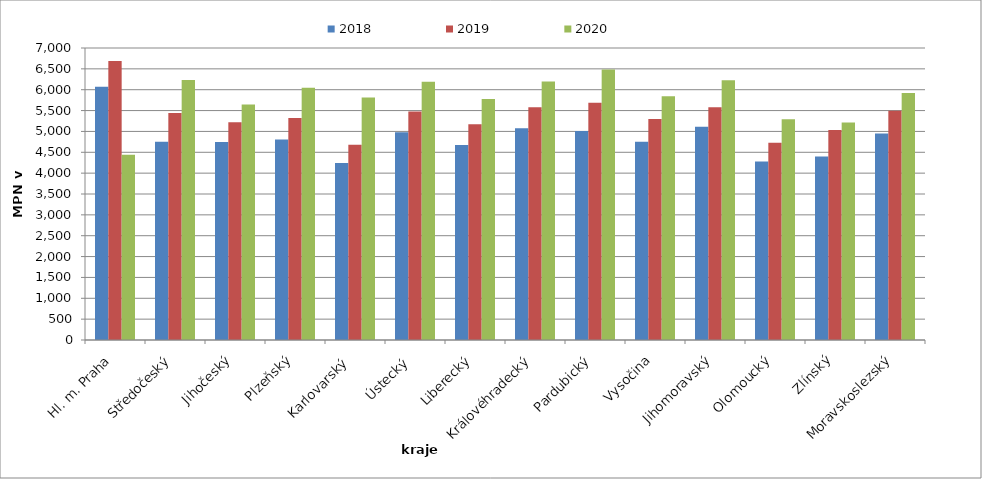
| Category | 2018 | 2019 | 2020 |
|---|---|---|---|
| Hl. m. Praha | 6069 | 6690 | 4442 |
| Středočeský | 4754 | 5441 | 6233 |
| Jihočeský | 4745 | 5220 | 5643 |
| Plzeňský | 4806 | 5319 | 6048 |
| Karlovarský  | 4244 | 4681 | 5813 |
| Ústecký   | 4980 | 5478 | 6193 |
| Liberecký | 4673 | 5170 | 5779 |
| Královéhradecký | 5074 | 5582 | 6195 |
| Pardubický | 5008 | 5687 | 6482 |
| Vysočina | 4752 | 5298 | 5846 |
| Jihomoravský | 5110 | 5581 | 6224 |
| Olomoucký | 4282 | 4731 | 5290 |
| Zlínský | 4399 | 5034 | 5216 |
| Moravskoslezský | 4951 | 5497 | 5923 |